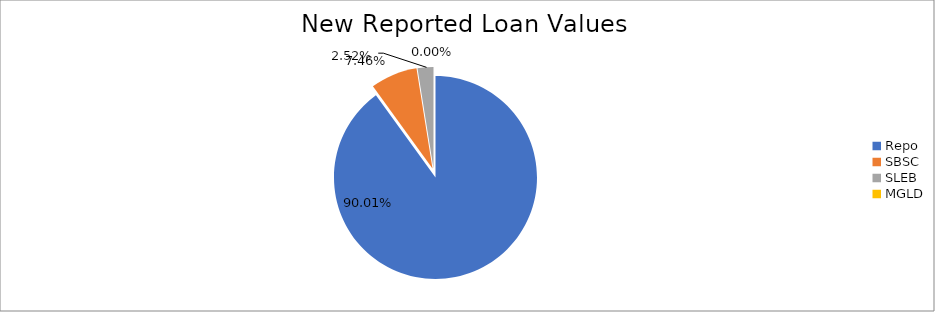
| Category | Series 0 |
|---|---|
| Repo | 11669964.7 |
| SBSC | 967325.089 |
| SLEB | 327078.965 |
| MGLD | 145.666 |